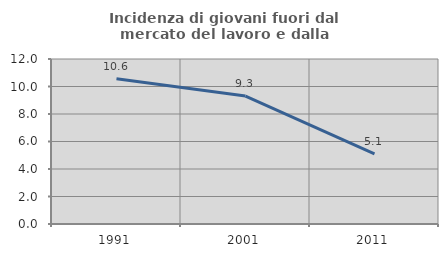
| Category | Incidenza di giovani fuori dal mercato del lavoro e dalla formazione  |
|---|---|
| 1991.0 | 10.556 |
| 2001.0 | 9.302 |
| 2011.0 | 5.102 |